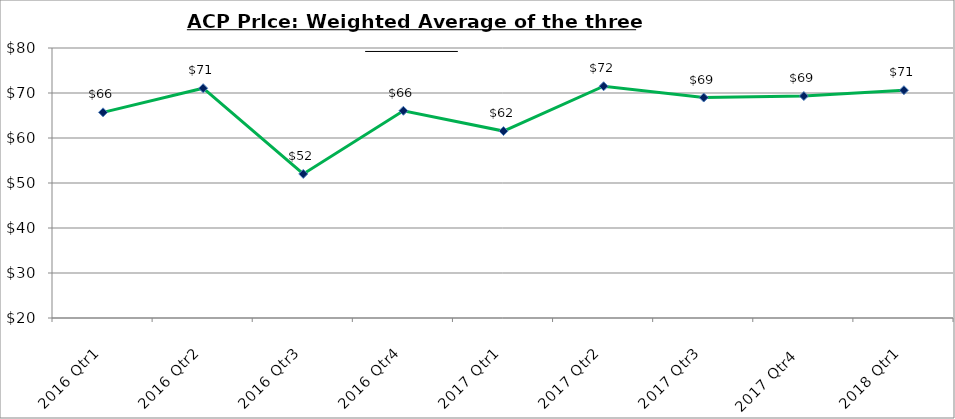
| Category | Series 0 |
|---|---|
| 2016 Qtr1 | 65.702 |
| 2016 Qtr2 | 71.068 |
| 2016 Qtr3 | 52.007 |
| 2016 Qtr4 | 66.048 |
| 2017 Qtr1 | 61.539 |
| 2017 Qtr2 | 71.5 |
| 2017 Qtr3 | 68.99 |
| 2017 Qtr4  | 69.318 |
| 2018 Qtr1 | 70.62 |